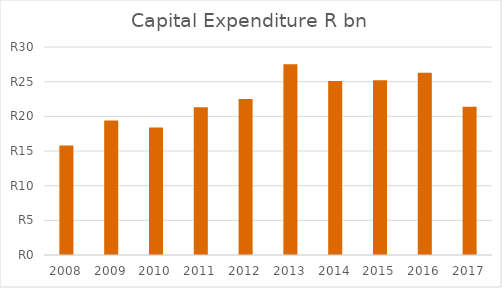
| Category | Capital Expenditure |
|---|---|
| 2008.0 | 15.8 |
| 2009.0 | 19.4 |
| 2010.0 | 18.4 |
| 2011.0 | 21.3 |
| 2012.0 | 22.5 |
| 2013.0 | 27.5 |
| 2014.0 | 25.1 |
| 2015.0 | 25.2 |
| 2016.0 | 26.3 |
| 2017.0 | 21.4 |